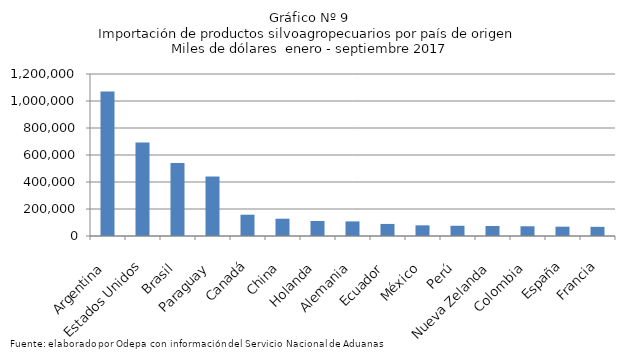
| Category | Series 0 |
|---|---|
| Argentina | 1069956.9 |
| Estados Unidos | 693465.424 |
| Brasil | 541015.005 |
| Paraguay | 440627.612 |
| Canadá | 157751.384 |
| China | 128064.521 |
| Holanda | 111162.452 |
| Alemania | 108126.349 |
| Ecuador | 89395.279 |
| México | 78950.712 |
| Perú | 75781.179 |
| Nueva Zelanda | 74253.337 |
| Colombia | 72005.055 |
| España | 69038.46 |
| Francia | 67685.707 |